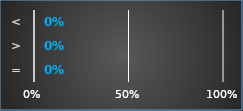
| Category | Series 0 |
|---|---|
| = | 0 |
| > | 0 |
| < | 0 |